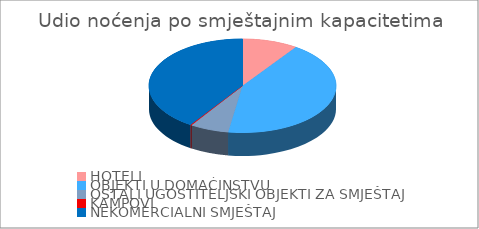
| Category | Series 1 | Series 0 |
|---|---|---|
| HOTELI | 9.613 | 146 |
| OBJEKTI U DOMAĆINSTVU | 42.83 | 474 |
| OSTALI UGOSTITELJSKI OBJEKTI ZA SMJEŠTAJ | 6.666 | 526 |
| KAMPOVI | 0.232 | 0 |
| NEKOMERCIALNI SMJEŠTAJ | 40.659 | 1146 |